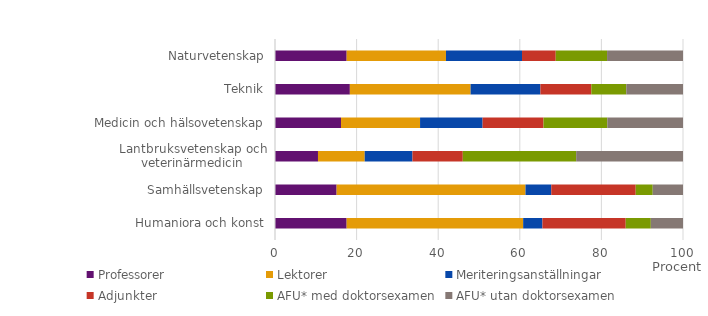
| Category | Professorer | Lektorer | Meriteringsanställningar | Adjunkter | AFU* med doktorsexamen | AFU* utan doktorsexamen |
|---|---|---|---|---|---|---|
| Humaniora och konst | 17.56 | 43.264 | 4.722 | 20.416 | 6.152 | 7.887 |
| Samhällsvetenskap | 15.103 | 46.294 | 6.314 | 20.701 | 4.169 | 7.42 |
| Lantbruksvetenskap och veterinärmedicin | 10.535 | 11.453 | 11.702 | 12.338 | 27.786 | 26.187 |
| Medicin och hälsovetenskap | 16.183 | 19.371 | 15.33 | 14.921 | 15.642 | 18.552 |
| Teknik | 18.347 | 29.595 | 17.103 | 12.482 | 8.57 | 13.903 |
| Naturvetenskap | 17.565 | 24.339 | 18.637 | 8.265 | 12.581 | 18.613 |